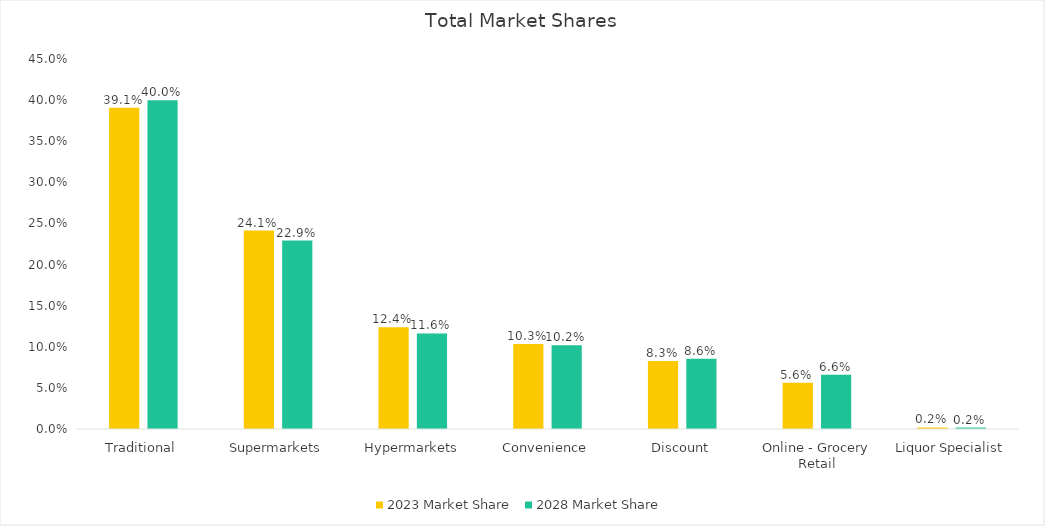
| Category | 2023 Market Share | 2028 Market Share |
|---|---|---|
| Traditional | 0.391 | 0.4 |
| Supermarkets | 0.241 | 0.229 |
| Hypermarkets | 0.124 | 0.116 |
| Convenience | 0.103 | 0.102 |
| Discount | 0.083 | 0.086 |
| Online - Grocery Retail | 0.056 | 0.066 |
| Liquor Specialist | 0.002 | 0.002 |